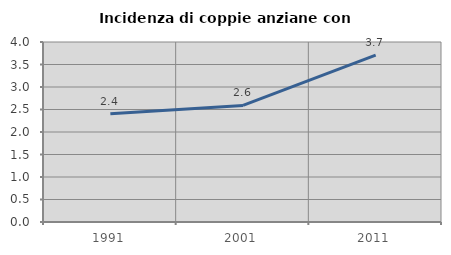
| Category | Incidenza di coppie anziane con figli |
|---|---|
| 1991.0 | 2.408 |
| 2001.0 | 2.591 |
| 2011.0 | 3.707 |